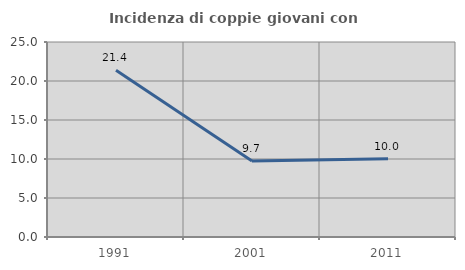
| Category | Incidenza di coppie giovani con figli |
|---|---|
| 1991.0 | 21.39 |
| 2001.0 | 9.744 |
| 2011.0 | 10.048 |